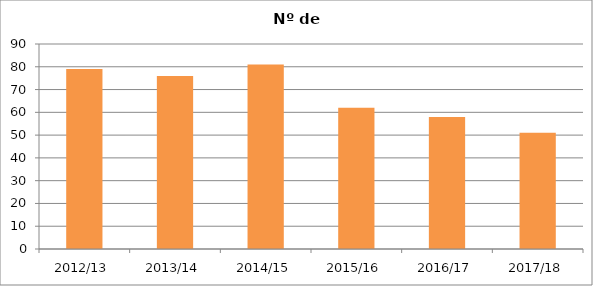
| Category | Nº de Cursos |
|---|---|
| 2012/13 | 79 |
| 2013/14 | 76 |
| 2014/15 | 81 |
| 2015/16 | 62 |
| 2016/17 | 58 |
| 2017/18 | 51 |